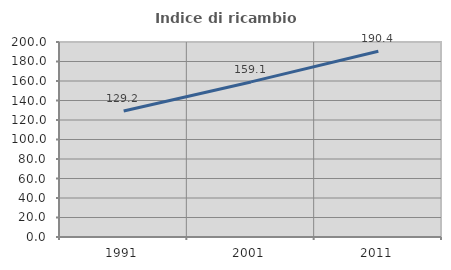
| Category | Indice di ricambio occupazionale  |
|---|---|
| 1991.0 | 129.198 |
| 2001.0 | 159.061 |
| 2011.0 | 190.44 |